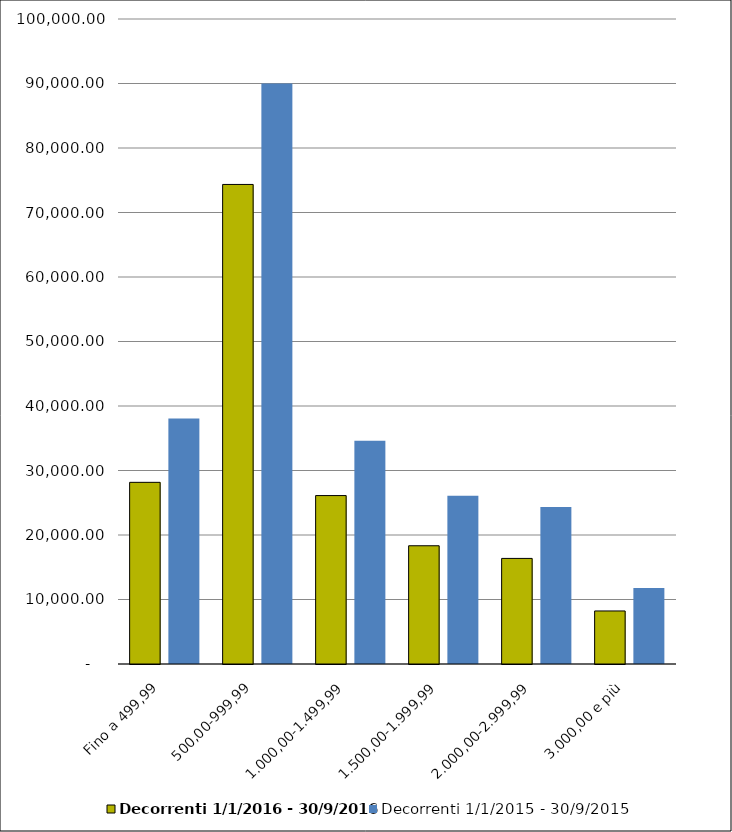
| Category | Decorrenti 1/1/2016 - 30/9/2016 | Decorrenti 1/1/2015 - 30/9/2015 |
|---|---|---|
| Fino a 499,99 | 28164 | 38072 |
| 500,00-999,99 | 74349 | 90008 |
| 1.000,00-1.499,99 | 26112 | 34626 |
| 1.500,00-1.999,99 | 18331 | 26077 |
| 2.000,00-2.999,99 | 16371 | 24339 |
| 3.000,00 e più | 8224 | 11787 |